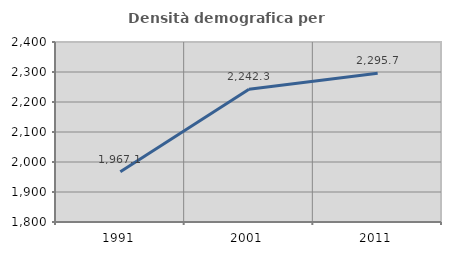
| Category | Densità demografica |
|---|---|
| 1991.0 | 1967.127 |
| 2001.0 | 2242.301 |
| 2011.0 | 2295.738 |